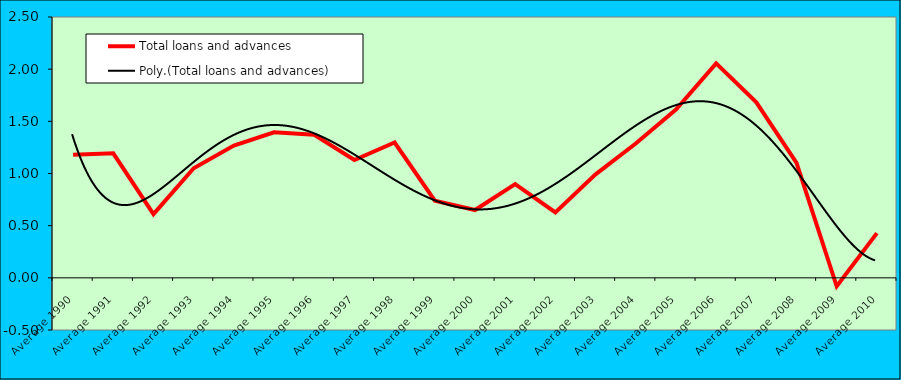
| Category | Total loans and advances |
|---|---|
| Average 1990 | 1.179 |
| Average 1991 | 1.193 |
| Average 1992 | 0.61 |
| Average 1993 | 1.051 |
| Average 1994 | 1.268 |
| Average 1995 | 1.394 |
| Average 1996 | 1.371 |
| Average 1997 | 1.129 |
| Average 1998 | 1.297 |
| Average 1999 | 0.739 |
| Average 2000 | 0.65 |
| Average 2001 | 0.898 |
| Average 2002 | 0.627 |
| Average 2003 | 0.992 |
| Average 2004 | 1.287 |
| Average 2005 | 1.613 |
| Average 2006 | 2.055 |
| Average 2007 | 1.682 |
| Average 2008 | 1.102 |
| Average 2009 | -0.081 |
| Average 2010 | 0.428 |